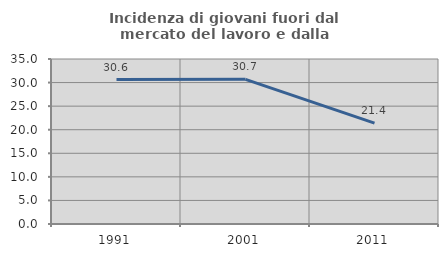
| Category | Incidenza di giovani fuori dal mercato del lavoro e dalla formazione  |
|---|---|
| 1991.0 | 30.626 |
| 2001.0 | 30.683 |
| 2011.0 | 21.389 |